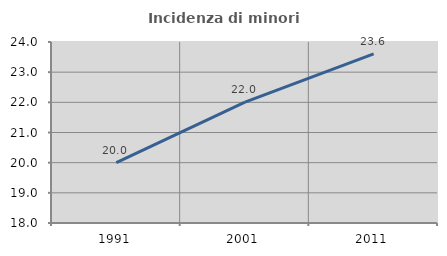
| Category | Incidenza di minori stranieri |
|---|---|
| 1991.0 | 20 |
| 2001.0 | 22.006 |
| 2011.0 | 23.605 |